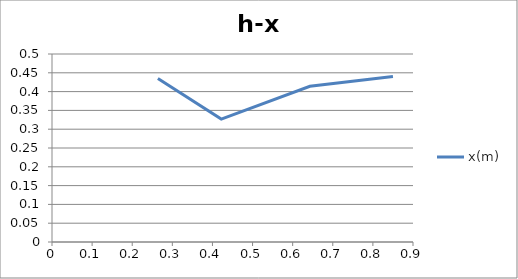
| Category | x(m) |
|---|---|
| 0.264 | 0.435 |
| 0.422 | 0.327 |
| 0.643 | 0.414 |
| 0.85 | 0.44 |